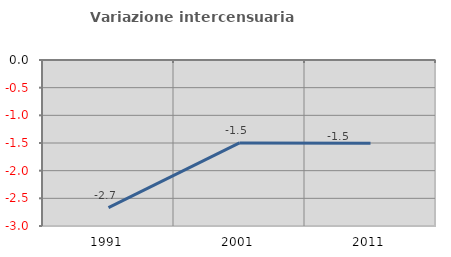
| Category | Variazione intercensuaria annua |
|---|---|
| 1991.0 | -2.667 |
| 2001.0 | -1.499 |
| 2011.0 | -1.504 |